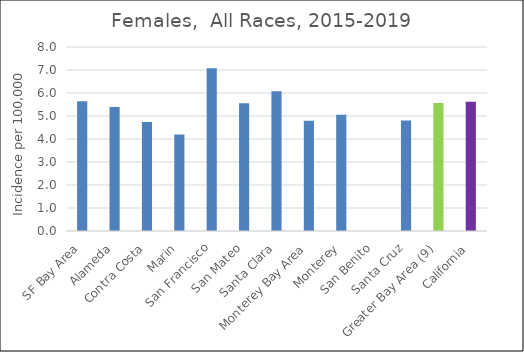
| Category | Female |
|---|---|
| SF Bay Area | 5.64 |
|   Alameda | 5.39 |
|   Contra Costa | 4.74 |
|   Marin | 4.2 |
|   San Francisco | 7.08 |
|   San Mateo | 5.55 |
|   Santa Clara | 6.08 |
| Monterey Bay Area | 4.79 |
|   Monterey | 5.05 |
|   San Benito | 0 |
|   Santa Cruz | 4.8 |
| Greater Bay Area (9) | 5.56 |
| California | 5.62 |